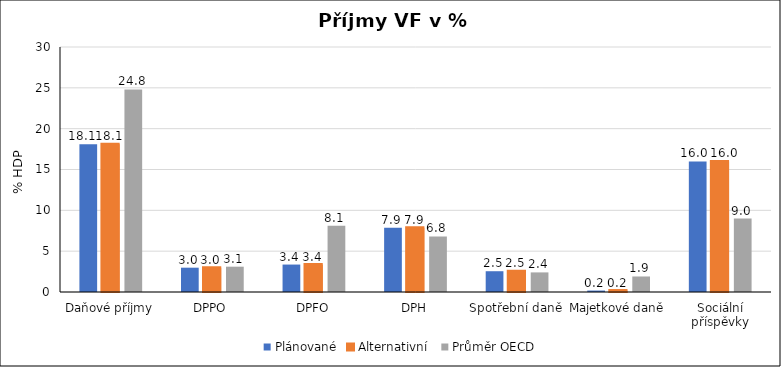
| Category | Plánované | Alternativní  | Průměr OECD |
|---|---|---|---|
| Daňové příjmy | 18.1 | 18.1 | 24.8 |
| DPPO | 2.978 | 2.978 | 3.1 |
| DPFO | 3.361 | 3.36 | 8.1 |
| DPH | 7.86 | 7.86 | 6.8 |
| Spotřební daně | 2.544 | 2.544 | 2.4 |
| Majetkové daně | 0.178 | 0.178 | 1.9 |
| Sociální příspěvky | 15.983 | 15.983 | 9 |